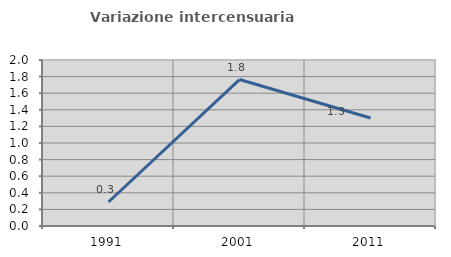
| Category | Variazione intercensuaria annua |
|---|---|
| 1991.0 | 0.289 |
| 2001.0 | 1.765 |
| 2011.0 | 1.301 |